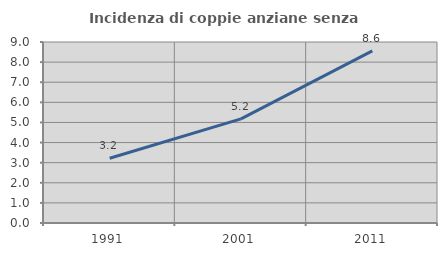
| Category | Incidenza di coppie anziane senza figli  |
|---|---|
| 1991.0 | 3.222 |
| 2001.0 | 5.175 |
| 2011.0 | 8.563 |